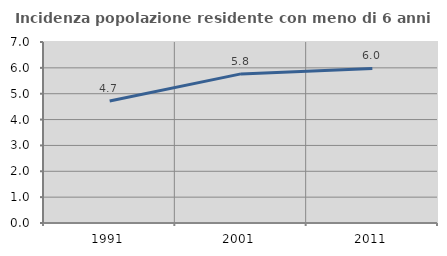
| Category | Incidenza popolazione residente con meno di 6 anni |
|---|---|
| 1991.0 | 4.72 |
| 2001.0 | 5.766 |
| 2011.0 | 5.979 |